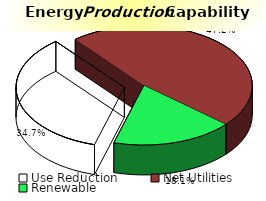
| Category | Series 0 |
|---|---|
| Use Reduction | 0.347 |
| Net Utilities | 0.472 |
| Renewable | 0.181 |